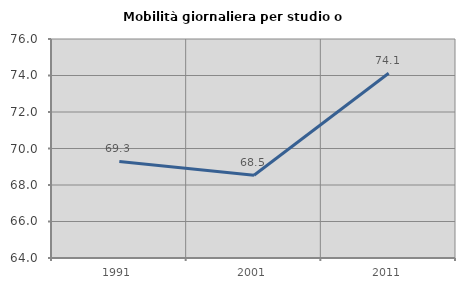
| Category | Mobilità giornaliera per studio o lavoro |
|---|---|
| 1991.0 | 69.289 |
| 2001.0 | 68.534 |
| 2011.0 | 74.123 |